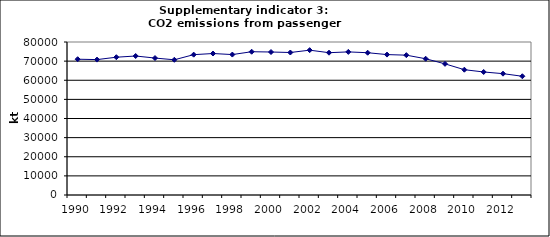
| Category | CO2 emissions from passenger cars, kt |
|---|---|
| 1990 | 70996.994 |
| 1991 | 70797.386 |
| 1992 | 72049.498 |
| 1993 | 72672.948 |
| 1994 | 71604.155 |
| 1995 | 70698.644 |
| 1996 | 73378.884 |
| 1997 | 73974.423 |
| 1998 | 73426.321 |
| 1999 | 74914.162 |
| 2000 | 74767.519 |
| 2001 | 74504.232 |
| 2002 | 75730.196 |
| 2003 | 74404.053 |
| 2004 | 74824.056 |
| 2005 | 74393.071 |
| 2006 | 73422.247 |
| 2007 | 73115.923 |
| 2008 | 71245.182 |
| 2009 | 68578.273 |
| 2010 | 65515.103 |
| 2011 | 64327.202 |
| 2012 | 63442.409 |
| 2013 | 62089.706 |